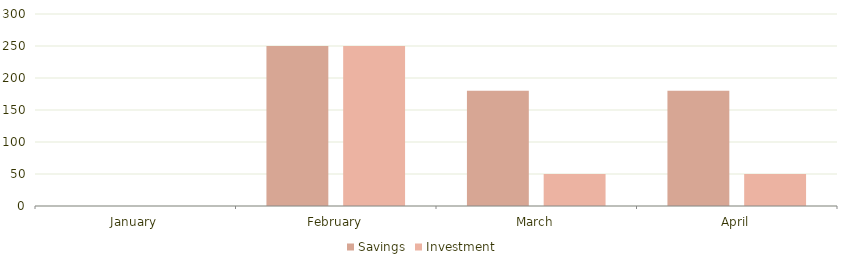
| Category | Savings | Investment |
|---|---|---|
| January | 0 | 0 |
| February | 250 | 250 |
| March | 180 | 50 |
| April | 180 | 50 |